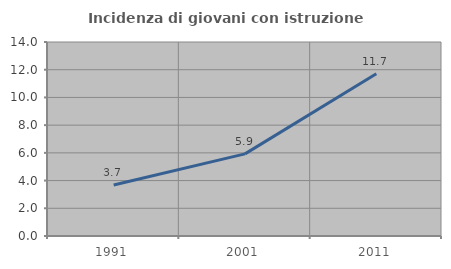
| Category | Incidenza di giovani con istruzione universitaria |
|---|---|
| 1991.0 | 3.676 |
| 2001.0 | 5.926 |
| 2011.0 | 11.712 |